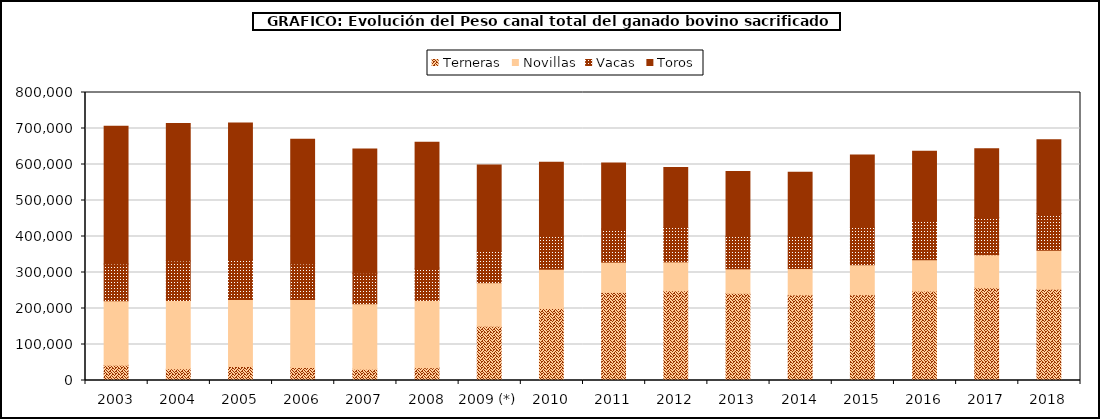
| Category | Terneras | Novillas | Vacas | Toros |
|---|---|---|---|---|
| 2003 | 42608 | 178849.967 | 102375.937 | 382535.472 |
| 2004 | 32509.696 | 189629.471 | 110072.96 | 381674.199 |
| 2005 | 38749.36 | 186497.831 | 110798.423 | 379285.221 |
| 2006 | 36032.274 | 189084.616 | 98804.791 | 346485.954 |
| 2007 | 31445.341 | 181838.873 | 84917.657 | 344965.587 |
| 2008 | 35627.401 | 186852.322 | 89884.28 | 349367.497 |
| 2009 (*) | 150694.983 | 121013.078 | 87398.819 | 239318.172 |
| 2010 | 199955.359 | 109158.53 | 90751.469 | 206730.181 |
| 2011 | 244730.574 | 84120.636 | 91909.223 | 183351.72 |
| 2012 | 249278.477 | 80252.629 | 95185.691 | 166603.472 |
| 2013 | 242186.585 | 68048.006 | 90078.606 | 180527.091 |
| 2014 | 237629.148 | 73287.378 | 90109.546 | 177574.131 |
| 2015 | 238108.353 | 83104.642 | 104715.455 | 200175.588 |
| 2016 | 248376.799 | 87111.714 | 108065.349 | 193458.873 |
| 2017 | 257454.509 | 91771.511 | 103786.006 | 190848.614 |
| 2018 | 253487.765 | 108585.18 | 101489.485 | 205445.855 |